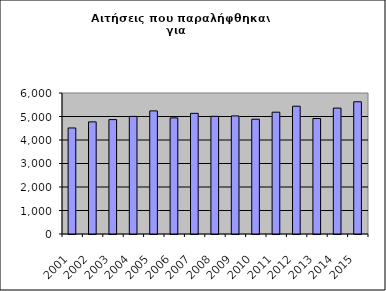
| Category | Series 1 |
|---|---|
| 2001.0 | 4512 |
| 2002.0 | 4771 |
| 2003.0 | 4868 |
| 2004.0 | 5004 |
| 2005.0 | 5239 |
| 2006.0 | 4941 |
| 2007.0 | 5134 |
| 2008.0 | 5007 |
| 2009.0 | 5025 |
| 2010.0 | 4883 |
| 2011.0 | 5184 |
| 2012.0 | 5438 |
| 2013.0 | 4914 |
| 2014.0 | 5357 |
| 2015.0 | 5627 |